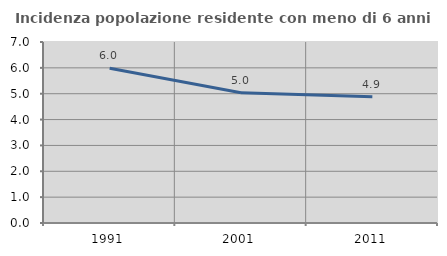
| Category | Incidenza popolazione residente con meno di 6 anni |
|---|---|
| 1991.0 | 5.986 |
| 2001.0 | 5.039 |
| 2011.0 | 4.883 |